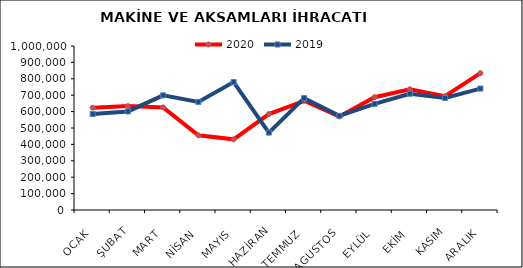
| Category | 2020 | 2019 |
|---|---|---|
| OCAK | 623706.395 | 585565.299 |
| ŞUBAT | 633534.138 | 600962.951 |
| MART | 625451.78 | 699023.771 |
| NİSAN | 455478.113 | 659064.66 |
| MAYIS | 430827.645 | 780143.589 |
| HAZİRAN | 585171.132 | 472013.339 |
| TEMMUZ | 665882.56 | 682365.409 |
| AGUSTOS | 570518.742 | 574258.039 |
| EYLÜL | 687739.601 | 647140.809 |
| EKİM | 735862.863 | 709053.58 |
| KASIM | 694056.156 | 682989.427 |
| ARALIK | 834559.542 | 740427.198 |